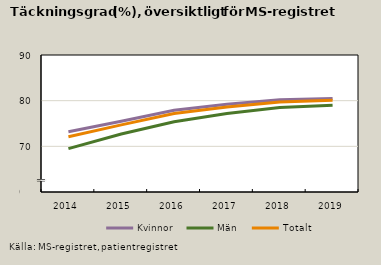
| Category | Kvinnor | Män | Totalt |
|---|---|---|---|
| 2014 | 73.2 | 69.5 | 72.1 |
| 2015 | 75.5 | 72.7 | 74.7 |
| 2016 | 77.9 | 75.4 | 77.2 |
| 2017 | 79.2 | 77.2 | 78.6 |
| 2018 | 80.2 | 78.5 | 79.7 |
| 2019 | 80.5 | 79 | 80.1 |